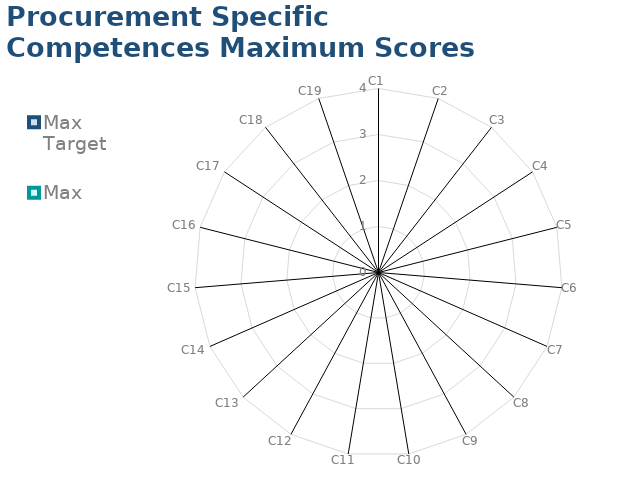
| Category | Max Target | Max |
|---|---|---|
| C1 | 0 | 0 |
| C2 | 0 | 0 |
| C3 | 0 | 0 |
| C4 | 0 | 0 |
| C5 | 0 | 0 |
| C6 | 0 | 0 |
| C7 | 0 | 0 |
| C8 | 0 | 0 |
| C9 | 0 | 0 |
| C10 | 0 | 0 |
| C11 | 0 | 0 |
| C12 | 0 | 0 |
| C13 | 0 | 0 |
| C14 | 0 | 0 |
| C15 | 0 | 0 |
| C16 | 0 | 0 |
| C17 | 0 | 0 |
| C18 | 0 | 0 |
| C19 | 0 | 0 |